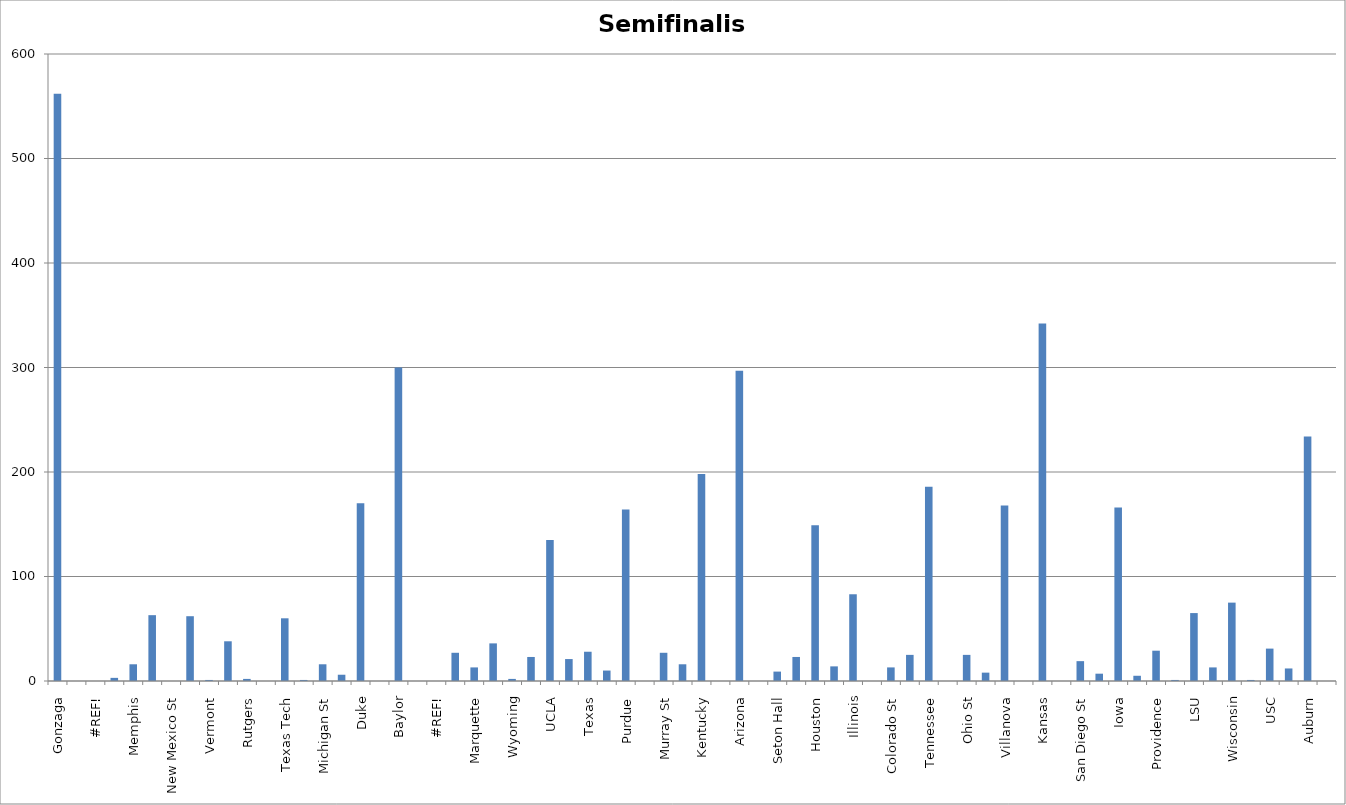
| Category | Semifinalist |
|---|---|
| Gonzaga | 562 |
| Georgia St | 0 |
| #REF! | 0 |
| Boise St | 3 |
| Memphis | 16 |
| Connecticut | 63 |
| New Mexico St | 0 |
| Arkansas | 62 |
| Vermont | 1 |
| Alabama | 38 |
| Rutgers | 2 |
| Notre Dame | 0 |
| Texas Tech | 60 |
| Montana St | 1 |
| Michigan St | 16 |
| Davidson | 6 |
| Duke | 170 |
| CS Fullerton | 0 |
| Baylor | 300 |
| Norfolk St | 0 |
| #REF! | 0 |
| North Carolina | 27 |
| Marquette | 13 |
| Saint Mary's | 36 |
| Wyoming | 2 |
| Indiana | 23 |
| UCLA | 135 |
| Akron | 21 |
| Texas | 28 |
| Virgina Tech | 10 |
| Purdue | 164 |
| Yale | 0 |
| Murray St | 27 |
| San Francisco | 16 |
| Kentucky | 198 |
| St. Peter's | 0 |
| Arizona | 297 |
| Wright St | 0 |
| Seton Hall | 9 |
| TCU | 23 |
| Houston | 149 |
| UAB | 14 |
| Illinois | 83 |
| Chattanooga | 0 |
| Colorado St | 13 |
| Michigan | 25 |
| Tennessee | 186 |
| Longwood | 0 |
| Ohio St | 25 |
| Loyola Chicago | 8 |
| Villanova | 168 |
| Delaware | 0 |
| Kansas | 342 |
| Texas Southern | 0 |
| San Diego St | 19 |
| Creighton | 7 |
| Iowa | 166 |
| Richmond | 5 |
| Providence | 29 |
| South Dakota St | 1 |
| LSU | 65 |
| Iowa St | 13 |
| Wisconsin | 75 |
| Colgate | 1 |
| USC | 31 |
| Miami Florida | 12 |
| Auburn | 234 |
| Jacksonville St | 0 |